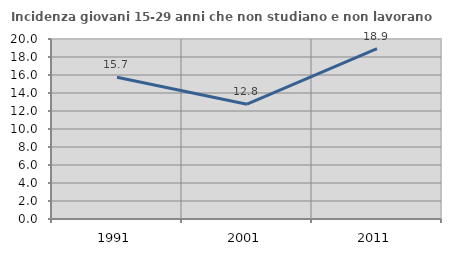
| Category | Incidenza giovani 15-29 anni che non studiano e non lavorano  |
|---|---|
| 1991.0 | 15.745 |
| 2001.0 | 12.755 |
| 2011.0 | 18.919 |